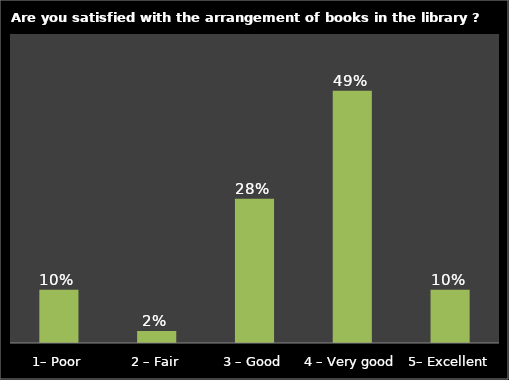
| Category | Series 0 |
|---|---|
| 1– Poor | 0.103 |
| 2 – Fair | 0.023 |
| 3 – Good | 0.28 |
| 4 – Very good | 0.49 |
| 5– Excellent | 0.103 |